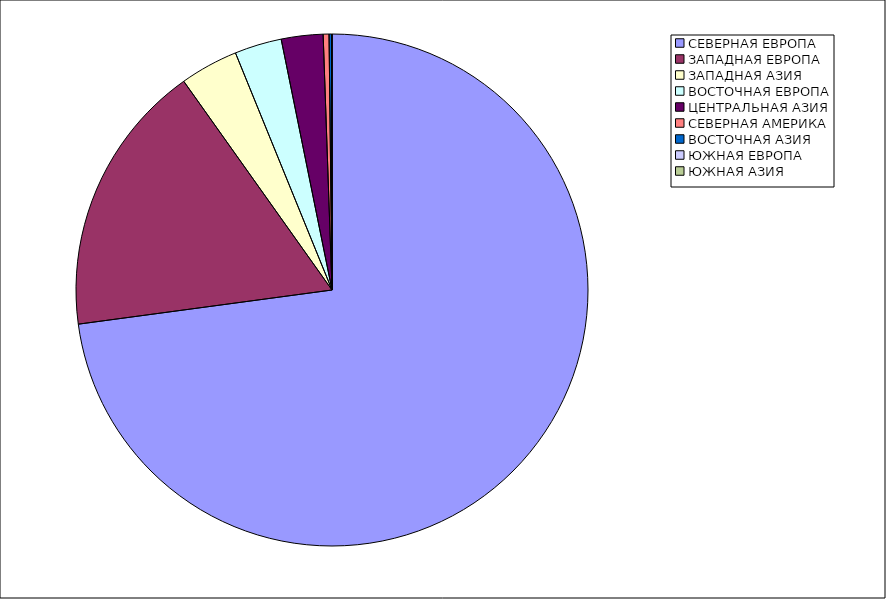
| Category | Оборот |
|---|---|
| СЕВЕРНАЯ ЕВРОПА | 72.869 |
| ЗАПАДНАЯ ЕВРОПА | 17.301 |
| ЗАПАДНАЯ АЗИЯ | 3.675 |
| ВОСТОЧНАЯ ЕВРОПА | 2.972 |
| ЦЕНТРАЛЬНАЯ АЗИЯ | 2.632 |
| СЕВЕРНАЯ АМЕРИКА | 0.367 |
| ВОСТОЧНАЯ АЗИЯ | 0.169 |
| ЮЖНАЯ ЕВРОПА | 0.01 |
| ЮЖНАЯ АЗИЯ | 0.006 |